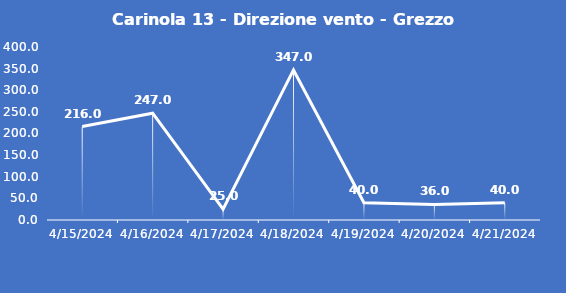
| Category | Carinola 13 - Direzione vento - Grezzo (°N) |
|---|---|
| 4/15/24 | 216 |
| 4/16/24 | 247 |
| 4/17/24 | 25 |
| 4/18/24 | 347 |
| 4/19/24 | 40 |
| 4/20/24 | 36 |
| 4/21/24 | 40 |